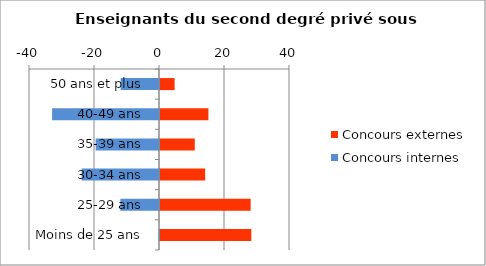
| Category | Concours externes | Concours internes |
|---|---|---|
| 50 ans et plus | 4.5 | -11.8 |
| 40-49 ans | 14.9 | -32.9 |
| 35-39 ans | 10.7 | -19.5 |
| 30-34 ans | 13.9 | -23.8 |
| 25-29 ans | 27.9 | -11.9 |
| Moins de 25 ans | 28.1 | -0.1 |